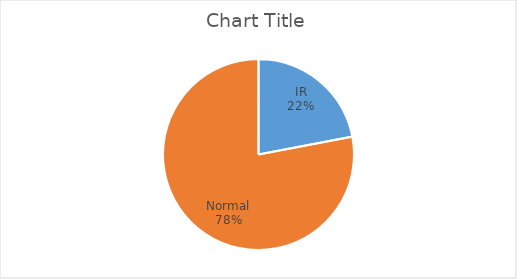
| Category | Series 0 |
|---|---|
| IR | 22 |
| Normal | 78 |